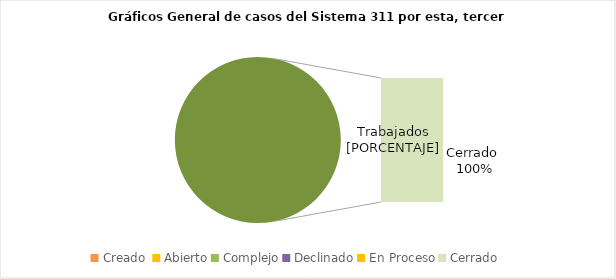
| Category | Series 0 |
|---|---|
| Creado  | 0 |
| Abierto | 0 |
| Complejo | 0 |
| Declinado | 0 |
| En Proceso | 0 |
| Cerrado  | 2 |